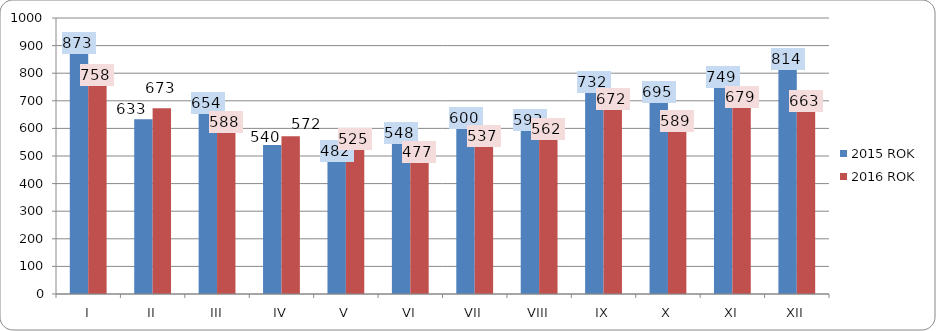
| Category | 2015 ROK | 2016 ROK |
|---|---|---|
| I | 873 | 758 |
| II | 633 | 673 |
| III | 654 | 588 |
| IV | 540 | 572 |
| V | 482 | 525 |
| VI | 548 | 477 |
| VII | 600 | 537 |
| VIII | 593 | 562 |
| IX | 732 | 672 |
| X | 695 | 589 |
| XI | 749 | 679 |
| XII | 814 | 663 |